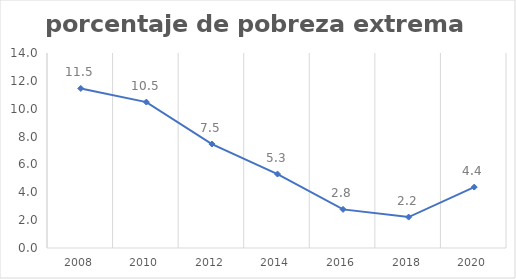
| Category | Series 0 |
|---|---|
| 2008.0 | 11.455 |
| 2010.0 | 10.474 |
| 2012.0 | 7.464 |
| 2014.0 | 5.31 |
| 2016.0 | 2.773 |
| 2018.0 | 2.22 |
| 2020.0 | 4.372 |